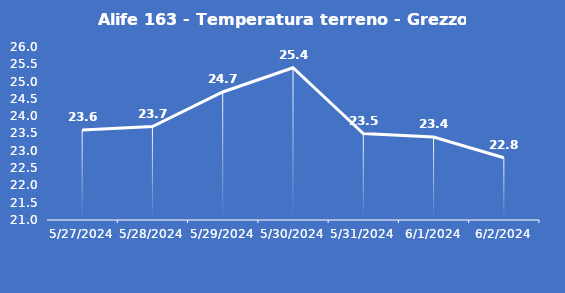
| Category | Alife 163 - Temperatura terreno - Grezzo (°C) |
|---|---|
| 5/27/24 | 23.6 |
| 5/28/24 | 23.7 |
| 5/29/24 | 24.7 |
| 5/30/24 | 25.4 |
| 5/31/24 | 23.5 |
| 6/1/24 | 23.4 |
| 6/2/24 | 22.8 |